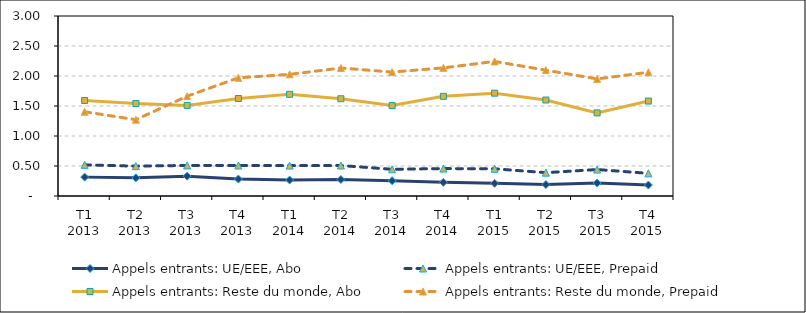
| Category | Appels entrants: UE/EEE, Abo | Appels entrants: UE/EEE, Prepaid | Appels entrants: Reste du monde, Abo | Appels entrants: Reste du monde, Prepaid |
|---|---|---|---|---|
| T1 2013 | 0.315 | 0.52 | 1.592 | 1.404 |
| T2 2013 | 0.302 | 0.497 | 1.541 | 1.272 |
| T3 2013 | 0.331 | 0.51 | 1.51 | 1.664 |
| T4 2013 | 0.283 | 0.509 | 1.625 | 1.97 |
| T1 2014 | 0.266 | 0.507 | 1.695 | 2.027 |
| T2 2014 | 0.275 | 0.508 | 1.621 | 2.133 |
| T3 2014 | 0.254 | 0.445 | 1.507 | 2.066 |
| T4 2014 | 0.228 | 0.457 | 1.661 | 2.136 |
| T1 2015 | 0.211 | 0.453 | 1.714 | 2.243 |
| T2 2015 | 0.19 | 0.389 | 1.6 | 2.097 |
| T3 2015 | 0.217 | 0.441 | 1.385 | 1.951 |
| T4 2015 | 0.182 | 0.378 | 1.582 | 2.062 |